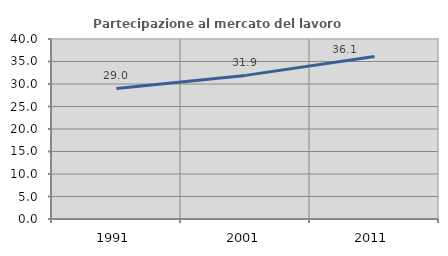
| Category | Partecipazione al mercato del lavoro  femminile |
|---|---|
| 1991.0 | 29.018 |
| 2001.0 | 31.914 |
| 2011.0 | 36.088 |